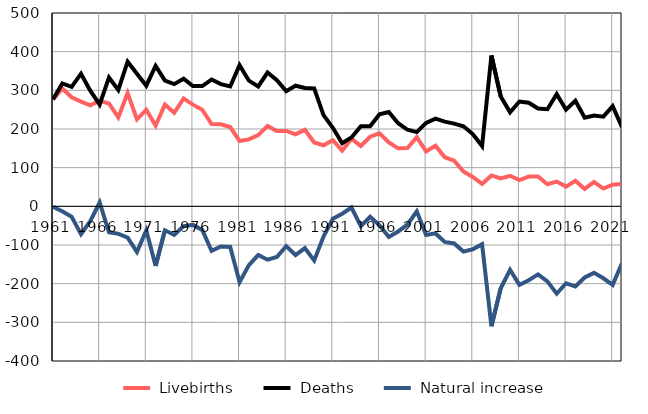
| Category |  Livebirths |  Deaths |  Natural increase |
|---|---|---|---|
| 1961.0 | 276 | 277 | -1 |
| 1962.0 | 305 | 318 | -13 |
| 1963.0 | 282 | 309 | -27 |
| 1964.0 | 271 | 343 | -72 |
| 1965.0 | 261 | 299 | -38 |
| 1966.0 | 273 | 263 | 10 |
| 1967.0 | 266 | 333 | -67 |
| 1968.0 | 230 | 301 | -71 |
| 1969.0 | 293 | 374 | -81 |
| 1970.0 | 225 | 343 | -118 |
| 1971.0 | 250 | 312 | -62 |
| 1972.0 | 209 | 363 | -154 |
| 1973.0 | 263 | 325 | -62 |
| 1974.0 | 242 | 316 | -74 |
| 1975.0 | 279 | 330 | -51 |
| 1976.0 | 263 | 311 | -48 |
| 1977.0 | 250 | 311 | -61 |
| 1978.0 | 213 | 328 | -115 |
| 1979.0 | 212 | 316 | -104 |
| 1980.0 | 205 | 310 | -105 |
| 1981.0 | 169 | 365 | -196 |
| 1982.0 | 173 | 325 | -152 |
| 1983.0 | 184 | 310 | -126 |
| 1984.0 | 208 | 346 | -138 |
| 1985.0 | 195 | 326 | -131 |
| 1986.0 | 195 | 298 | -103 |
| 1987.0 | 186 | 312 | -126 |
| 1988.0 | 198 | 306 | -108 |
| 1989.0 | 165 | 305 | -140 |
| 1990.0 | 158 | 236 | -78 |
| 1991.0 | 171 | 203 | -32 |
| 1992.0 | 144 | 163 | -19 |
| 1993.0 | 175 | 178 | -3 |
| 1994.0 | 156 | 207 | -51 |
| 1995.0 | 180 | 207 | -27 |
| 1996.0 | 189 | 238 | -49 |
| 1997.0 | 165 | 244 | -79 |
| 1998.0 | 150 | 215 | -65 |
| 1999.0 | 151 | 198 | -47 |
| 2000.0 | 179 | 192 | -13 |
| 2001.0 | 142 | 216 | -74 |
| 2002.0 | 157 | 227 | -70 |
| 2003.0 | 127 | 219 | -92 |
| 2004.0 | 118 | 214 | -96 |
| 2005.0 | 90 | 207 | -117 |
| 2006.0 | 76 | 187 | -111 |
| 2007.0 | 58 | 156 | -98 |
| 2008.0 | 80 | 390 | -310 |
| 2009.0 | 72 | 284 | -212 |
| 2010.0 | 79 | 243 | -164 |
| 2011.0 | 68 | 271 | -203 |
| 2012.0 | 77 | 268 | -191 |
| 2013.0 | 77 | 253 | -176 |
| 2014.0 | 57 | 251 | -194 |
| 2015.0 | 64 | 290 | -226 |
| 2016.0 | 51 | 250 | -199 |
| 2017.0 | 66 | 273 | -207 |
| 2018.0 | 45 | 229 | -184 |
| 2019.0 | 63 | 235 | -172 |
| 2020.0 | 46 | 232 | -186 |
| 2021.0 | 56 | 259 | -203 |
| 2022.0 | 58 | 205 | -147 |